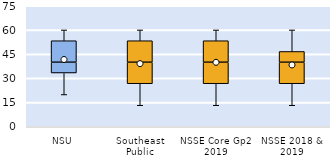
| Category | 25th | 50th | 75th |
|---|---|---|---|
| NSU | 33.333 | 6.667 | 13.333 |
| Southeast Public | 26.667 | 13.333 | 13.333 |
| NSSE Core Gp2 2019 | 26.667 | 13.333 | 13.333 |
| NSSE 2018 & 2019 | 26.667 | 13.333 | 6.667 |